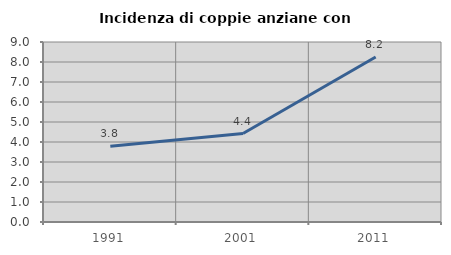
| Category | Incidenza di coppie anziane con figli |
|---|---|
| 1991.0 | 3.788 |
| 2001.0 | 4.425 |
| 2011.0 | 8.247 |